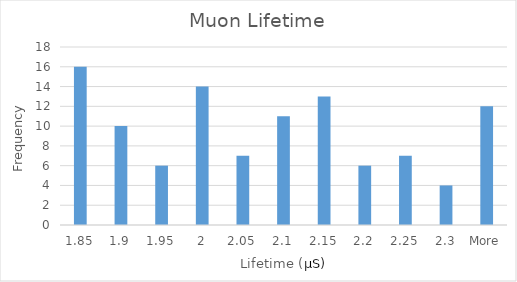
| Category | Frequency |
|---|---|
| 1.85 | 16 |
| 1.9 | 10 |
| 1.95 | 6 |
| 2 | 14 |
| 2.05 | 7 |
| 2.1 | 11 |
| 2.15 | 13 |
| 2.2 | 6 |
| 2.25 | 7 |
| 2.3 | 4 |
| More | 12 |